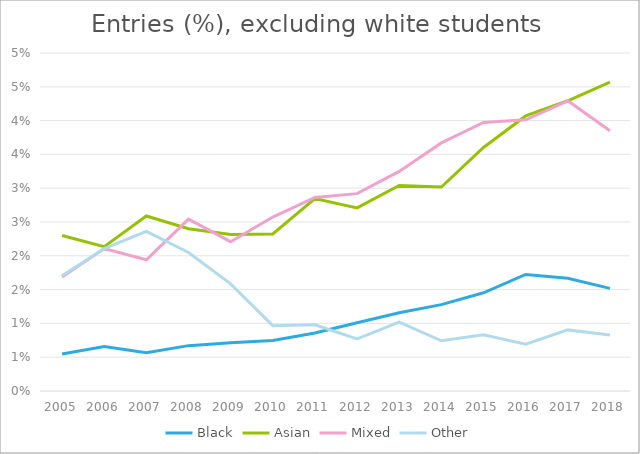
| Category | Black | Asian | Mixed | Other |
|---|---|---|---|---|
| 2005.0 | 0.005 | 0.023 | 0.017 | 0.017 |
| 2006.0 | 0.007 | 0.021 | 0.021 | 0.021 |
| 2007.0 | 0.006 | 0.026 | 0.019 | 0.024 |
| 2008.0 | 0.007 | 0.024 | 0.025 | 0.02 |
| 2009.0 | 0.007 | 0.023 | 0.022 | 0.016 |
| 2010.0 | 0.007 | 0.023 | 0.026 | 0.01 |
| 2011.0 | 0.009 | 0.028 | 0.029 | 0.01 |
| 2012.0 | 0.01 | 0.027 | 0.029 | 0.008 |
| 2013.0 | 0.012 | 0.03 | 0.032 | 0.01 |
| 2014.0 | 0.013 | 0.03 | 0.037 | 0.007 |
| 2015.0 | 0.015 | 0.036 | 0.04 | 0.008 |
| 2016.0 | 0.017 | 0.041 | 0.04 | 0.007 |
| 2017.0 | 0.017 | 0.043 | 0.043 | 0.009 |
| 2018.0 | 0.015 | 0.046 | 0.038 | 0.008 |